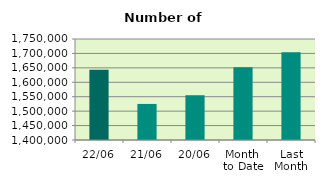
| Category | Series 0 |
|---|---|
| 22/06 | 1643152 |
| 21/06 | 1524980 |
| 20/06 | 1555124 |
| Month 
to Date | 1651836.625 |
| Last
Month | 1704183.545 |